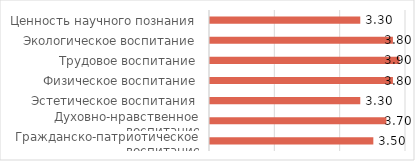
| Category | Средний
 балл |
|---|---|
| Гражданско-патриотическое воспитание | 3.5 |
| Духовно-нравственное воспитание | 3.7 |
| Эстетическое воспитания | 3.3 |
| Физическое воспитание | 3.8 |
| Трудовое воспитание | 3.9 |
| Экологическое воспитание | 3.8 |
| Ценность научного познания | 3.3 |